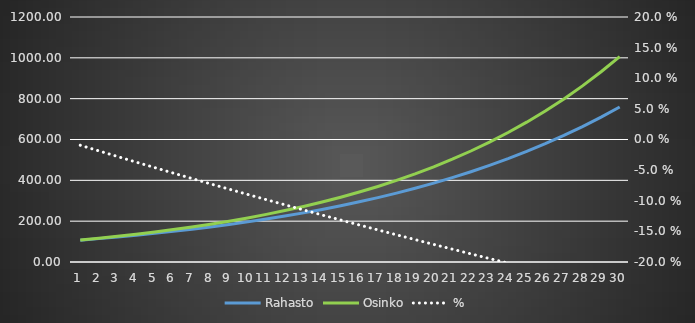
| Category | Rahasto | Osinko |
|---|---|---|
| 1.0 | 106.99 | 108 |
| 2.0 | 114.469 | 116.64 |
| 3.0 | 122.47 | 125.971 |
| 4.0 | 131.031 | 136.049 |
| 5.0 | 140.19 | 146.933 |
| 6.0 | 149.989 | 158.687 |
| 7.0 | 160.473 | 171.382 |
| 8.0 | 171.69 | 185.093 |
| 9.0 | 183.691 | 199.9 |
| 10.0 | 196.531 | 215.892 |
| 11.0 | 210.269 | 233.164 |
| 12.0 | 224.967 | 251.817 |
| 13.0 | 240.692 | 271.962 |
| 14.0 | 257.516 | 293.719 |
| 15.0 | 275.517 | 317.217 |
| 16.0 | 294.775 | 342.594 |
| 17.0 | 315.38 | 370.002 |
| 18.0 | 337.425 | 399.602 |
| 19.0 | 361.011 | 431.57 |
| 20.0 | 386.246 | 466.096 |
| 21.0 | 413.244 | 503.383 |
| 22.0 | 442.13 | 543.654 |
| 23.0 | 473.035 | 587.146 |
| 24.0 | 506.1 | 634.118 |
| 25.0 | 541.477 | 684.848 |
| 26.0 | 579.326 | 739.635 |
| 27.0 | 619.821 | 798.806 |
| 28.0 | 663.146 | 862.711 |
| 29.0 | 709.5 | 931.727 |
| 30.0 | 759.094 | 1006.266 |